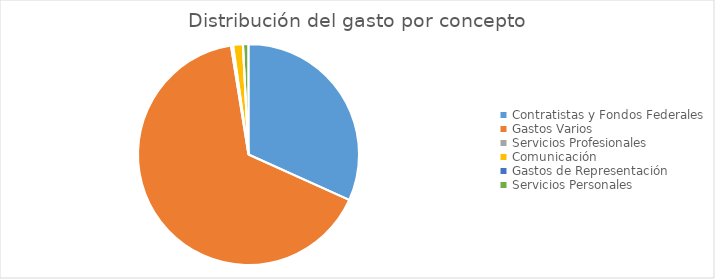
| Category | Series 0 |
|---|---|
| Contratistas y Fondos Federales | 185322070.11 |
| Gastos Varios | 383506151.3 |
| Servicios Profesionales | 1862900 |
| Comunicación | 8274131.32 |
| Gastos de Representación | 87731.76 |
| Servicios Personales | 4675025.17 |